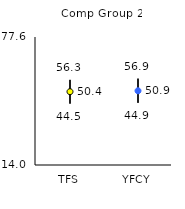
| Category | 25th | 75th | Mean |
|---|---|---|---|
| TFS | 44.5 | 56.3 | 50.43 |
| YFCY | 44.9 | 56.9 | 50.87 |